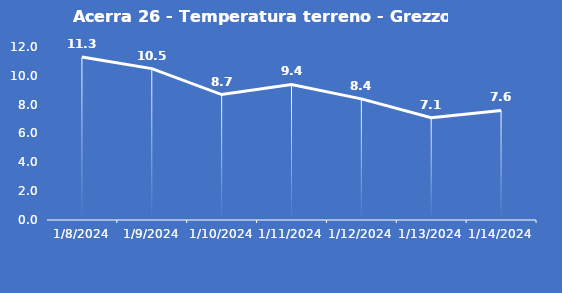
| Category | Acerra 26 - Temperatura terreno - Grezzo (°C) |
|---|---|
| 1/8/24 | 11.3 |
| 1/9/24 | 10.5 |
| 1/10/24 | 8.7 |
| 1/11/24 | 9.4 |
| 1/12/24 | 8.4 |
| 1/13/24 | 7.1 |
| 1/14/24 | 7.6 |